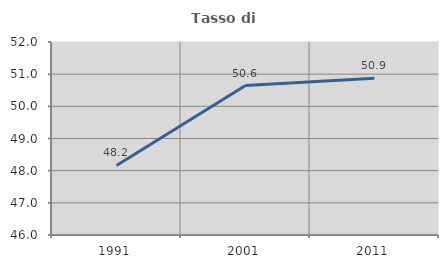
| Category | Tasso di occupazione   |
|---|---|
| 1991.0 | 48.164 |
| 2001.0 | 50.646 |
| 2011.0 | 50.872 |